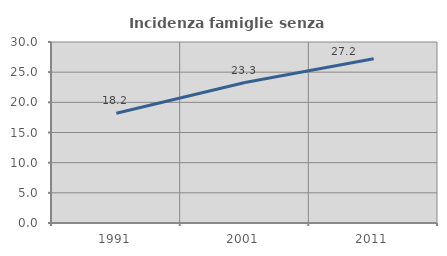
| Category | Incidenza famiglie senza nuclei |
|---|---|
| 1991.0 | 18.182 |
| 2001.0 | 23.276 |
| 2011.0 | 27.229 |